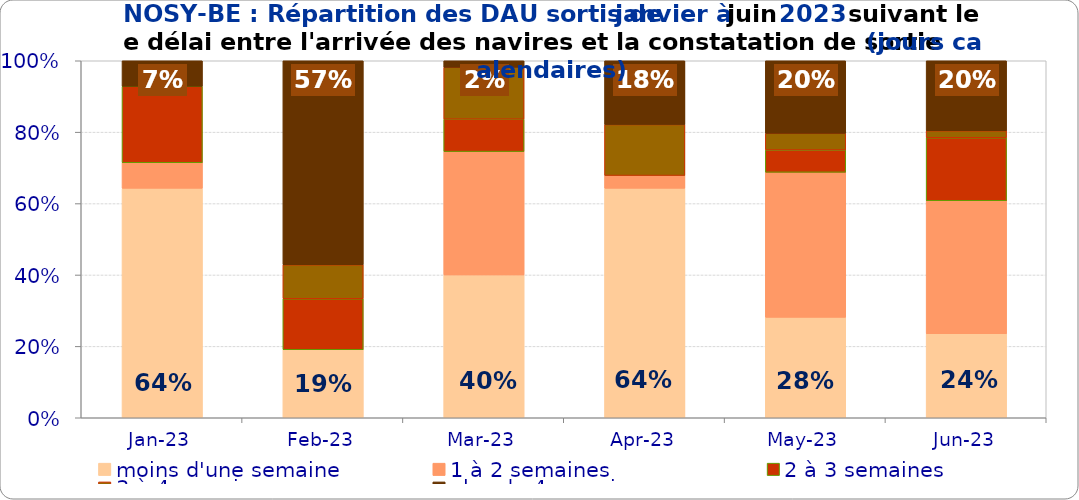
| Category | moins d'une semaine | 1 à 2 semaines | 2 à 3 semaines | 3 à 4 semaines | plus de 4 semaines |
|---|---|---|---|---|---|
| 2023-01-01 | 0.643 | 0.071 | 0.214 | 0 | 0.071 |
| 2023-02-01 | 0.19 | 0 | 0.143 | 0.095 | 0.571 |
| 2023-03-01 | 0.4 | 0.345 | 0.091 | 0.145 | 0.018 |
| 2023-04-01 | 0.643 | 0.036 | 0 | 0.143 | 0.179 |
| 2023-05-01 | 0.281 | 0.406 | 0.062 | 0.047 | 0.203 |
| 2023-06-01 | 0.235 | 0.373 | 0.176 | 0.02 | 0.196 |